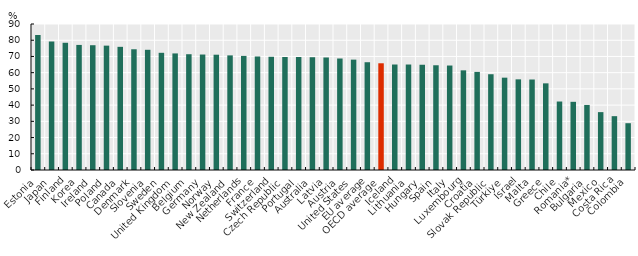
| Category | Baseline allrounder |
|---|---|
| Estonia | 83.204 |
| Japan | 79.178 |
| Finland | 78.426 |
| Korea | 77.1 |
| Ireland | 76.924 |
| Poland | 76.665 |
| Canada | 75.926 |
| Denmark | 74.429 |
| Slovenia | 74.103 |
| Sweden | 72.246 |
| United Kingdom | 71.862 |
| Belgium | 71.37 |
| Germany | 71.182 |
| Norway | 71.072 |
| New Zealand | 70.656 |
| Netherlands | 70.335 |
| France | 69.975 |
| Switzerland | 69.793 |
| Czech Republic | 69.667 |
| Portugal | 69.641 |
| Australia | 69.524 |
| Latvia | 69.363 |
| Austria | 68.728 |
| United States | 68.035 |
| EU average | 66.439 |
| OECD average | 65.787 |
| Iceland | 65.029 |
| Lithuania | 65.024 |
| Hungary | 64.883 |
| Spain | 64.566 |
| Italy | 64.404 |
| Luxembourg | 61.435 |
| Croatia | 60.469 |
| Slovak Republic | 59.036 |
| Türkiye | 56.916 |
| Israel | 55.881 |
| Malta | 55.782 |
| Greece | 53.418 |
| Chile | 42.218 |
| Romania* | 42.031 |
| Bulgaria | 40.106 |
| Mexico | 35.678 |
| Costa Rica | 33.186 |
| Colombia | 28.842 |